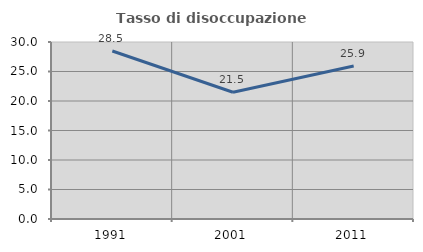
| Category | Tasso di disoccupazione giovanile  |
|---|---|
| 1991.0 | 28.471 |
| 2001.0 | 21.481 |
| 2011.0 | 25.941 |